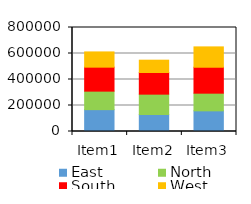
| Category | East | North | South | West |
|---|---|---|---|---|
| Item1 | 168136 | 142346 | 184414 | 117249 |
| Item2 | 130948 | 156328 | 166622 | 94705 |
| Item3 | 158944 | 135890 | 199509 | 156510 |